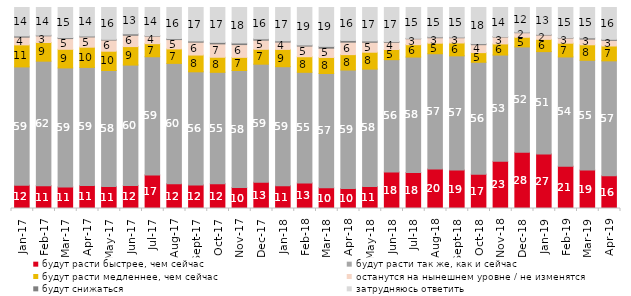
| Category | будут расти быстрее, чем сейчас | будут расти так же, как и сейчас | будут расти медленнее, чем сейчас | останутся на нынешнем уровне / не изменятся | будут снижаться | затрудняюсь ответить |
|---|---|---|---|---|---|---|
| 2017-01-01 | 11.6 | 58.85 | 10.95 | 3.85 | 0.6 | 14.15 |
| 2017-02-01 | 11.35 | 61.95 | 9.3 | 3.3 | 0.35 | 13.75 |
| 2017-03-01 | 10.7 | 59.25 | 9.25 | 5.35 | 0.45 | 15 |
| 2017-04-01 | 11.45 | 58.75 | 10.05 | 5.1 | 0.45 | 14.2 |
| 2017-05-01 | 11 | 57.65 | 9.6 | 5.55 | 0.35 | 15.85 |
| 2017-06-01 | 11.5 | 59.85 | 9.2 | 5.65 | 0.7 | 13.1 |
| 2017-07-01 | 16.7 | 58.8 | 6.5 | 3.75 | 0.25 | 14 |
| 2017-08-01 | 12.35 | 59.85 | 7.2 | 4.65 | 0.45 | 15.5 |
| 2017-09-01 | 11.75 | 56.25 | 8.35 | 6.4 | 0.6 | 16.65 |
| 2017-10-01 | 12.3 | 55.45 | 7.5 | 6.65 | 0.75 | 17.35 |
| 2017-11-01 | 10.4 | 58.25 | 6.55 | 6.35 | 0.8 | 17.65 |
| 2017-12-01 | 13.1 | 58.7 | 7.4 | 4.55 | 0.65 | 15.6 |
| 2018-01-01 | 11.35 | 59.2 | 8.6 | 3.65 | 0.6 | 16.6 |
| 2018-02-01 | 12.7 | 55.05 | 7.75 | 5.3 | 0.55 | 18.65 |
| 2018-03-01 | 10.3 | 56.85 | 8 | 4.6 | 0.9 | 19.35 |
| 2018-04-01 | 9.9 | 59 | 7.65 | 6.2 | 0.85 | 16.4 |
| 2018-05-01 | 10.95 | 58.4 | 8.4 | 4.95 | 0.65 | 16.65 |
| 2018-06-01 | 18.15 | 55.9 | 5.05 | 3.6 | 0.4 | 16.9 |
| 2018-07-01 | 17.85 | 57.5 | 6.15 | 2.95 | 0.2 | 15.35 |
| 2018-08-01 | 19.65 | 57.35 | 5.25 | 2.7 | 0.4 | 14.65 |
| 2018-09-01 | 19.1 | 56.85 | 6.4 | 2.6 | 0.3 | 14.75 |
| 2018-10-01 | 17.1 | 55.65 | 4.8 | 3.95 | 0.5 | 18 |
| 2018-11-01 | 23.453 | 52.894 | 5.539 | 3.443 | 0.2 | 14.471 |
| 2018-12-01 | 27.95 | 52.45 | 4.8 | 2.25 | 0.3 | 12.25 |
| 2019-01-01 | 27.15 | 50.9 | 6.1 | 2.15 | 0.3 | 13.4 |
| 2019-02-01 | 21.05 | 54.35 | 6.85 | 2.55 | 0.2 | 15 |
| 2019-03-01 | 19.095 | 54.649 | 7.708 | 2.834 | 0.597 | 15.117 |
| 2019-04-01 | 16.287 | 57.178 | 7.376 | 2.822 | 0.495 | 15.842 |